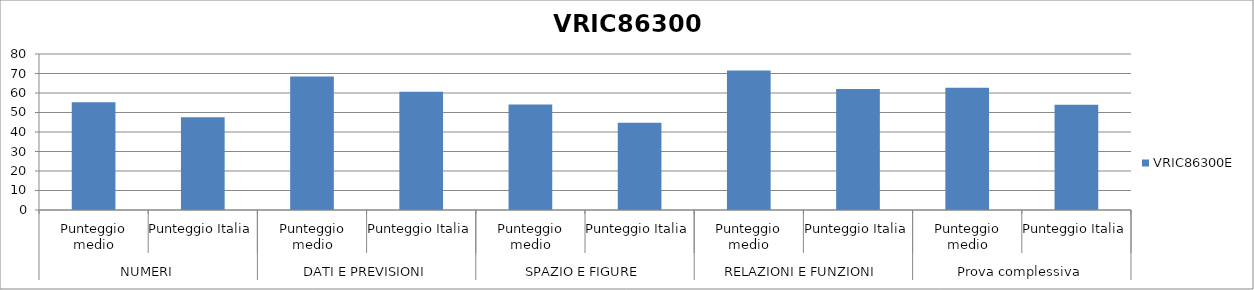
| Category | VRIC86300E |
|---|---|
| 0 | 55.2 |
| 1 | 47.6 |
| 2 | 68.4 |
| 3 | 60.7 |
| 4 | 54.1 |
| 5 | 44.8 |
| 6 | 71.6 |
| 7 | 62 |
| 8 | 62.7 |
| 9 | 54 |